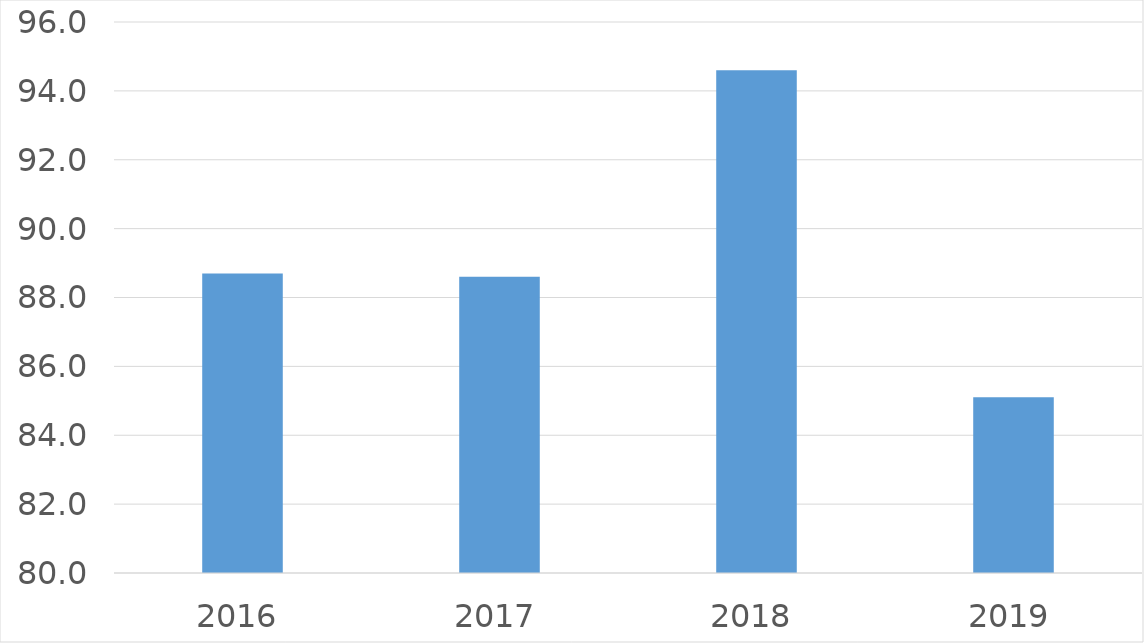
| Category | Series 0 |
|---|---|
| 2016 | 88.7 |
| 2017 | 88.6 |
| 2018 | 94.6 |
| 2019 | 85.1 |